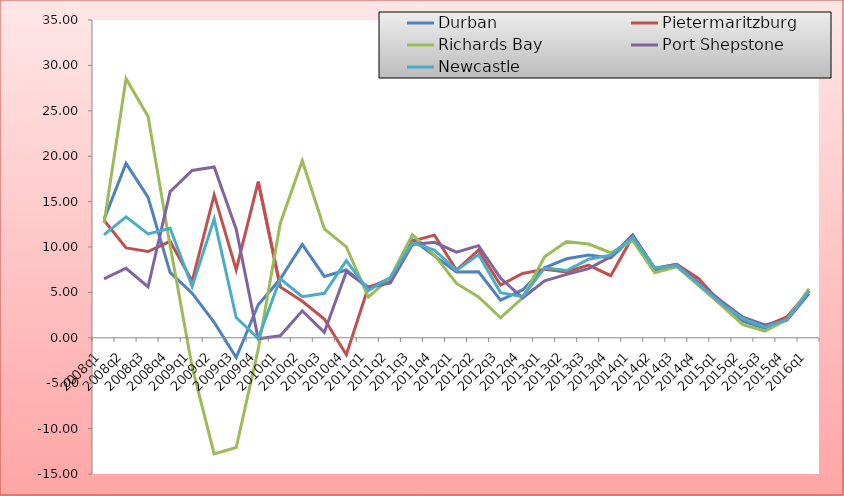
| Category | Durban | Pietermaritzburg | Richards Bay | Port Shepstone | Newcastle |
|---|---|---|---|---|---|
| 2008q1 | 13.024 | 12.951 | 12.606 | 6.501 | 11.336 |
| 2008q2 | 19.21 | 9.895 | 28.539 | 7.66 | 13.322 |
| 2008q3 | 15.464 | 9.504 | 24.364 | 5.614 | 11.436 |
| 2008q4 | 7.204 | 10.625 | 10.17 | 16.081 | 12.061 |
| 2009q1 | 4.911 | 6.222 | -3.196 | 18.435 | 5.64 |
| 2009q2 | 1.709 | 15.74 | -12.796 | 18.808 | 13.088 |
| 2009q3 | -2.176 | 7.502 | -12.082 | 11.952 | 2.231 |
| 2009q4 | 3.641 | 17.204 | -1.253 | -0.107 | -0.059 |
| 2010q1 | 6.468 | 5.608 | 12.6 | 0.22 | 6.507 |
| 2010q2 | 10.276 | 4.017 | 19.508 | 2.97 | 4.527 |
| 2010q3 | 6.755 | 2.062 | 12.001 | 0.606 | 4.895 |
| 2010q4 | 7.464 | -1.86 | 10.007 | 7.287 | 8.499 |
| 2011q1 | 5.482 | 5.611 | 4.483 | 5.529 | 5.21 |
| 2011q2 | 6.575 | 6.198 | 6.641 | 6.037 | 6.64 |
| 2011q3 | 10.788 | 10.655 | 11.355 | 10.283 | 10.453 |
| 2011q4 | 9.024 | 11.304 | 9.109 | 10.511 | 9.667 |
| 2012q1 | 7.251 | 7.453 | 5.988 | 9.424 | 7.423 |
| 2012q2 | 7.268 | 9.653 | 4.496 | 10.148 | 9.165 |
| 2012q3 | 4.154 | 5.82 | 2.2 | 6.581 | 4.975 |
| 2012q4 | 5.271 | 7.082 | 4.41 | 4.383 | 4.529 |
| 2013q1 | 7.716 | 7.538 | 8.921 | 6.273 | 7.694 |
| 2013q2 | 8.7 | 7.246 | 10.603 | 6.981 | 7.416 |
| 2013q3 | 9.118 | 8.014 | 10.322 | 7.622 | 8.658 |
| 2013q4 | 8.798 | 6.837 | 9.368 | 8.921 | 9.098 |
| 2014q1 | 11.087 | 11.141 | 10.706 | 11.346 | 11.043 |
| 2014q2 | 7.456 | 7.635 | 7.16 | 7.653 | 7.68 |
| 2014q3 | 7.927 | 8.088 | 7.823 | 8.094 | 7.948 |
| 2014q4 | 5.817 | 6.503 | 5.738 | 6.036 | 5.872 |
| 2015q1 | 3.785 | 3.809 | 3.64 | 4.092 | 3.82 |
| 2015q2 | 1.845 | 2.19 | 1.448 | 2.264 | 2.107 |
| 2015q3 | 1.047 | 1.289 | 0.744 | 1.409 | 1.176 |
| 2015q4 | 2.122 | 2.303 | 1.995 | 1.943 | 1.993 |
| 2016q1 | 5.165 | 5.132 | 5.384 | 4.877 | 5.156 |